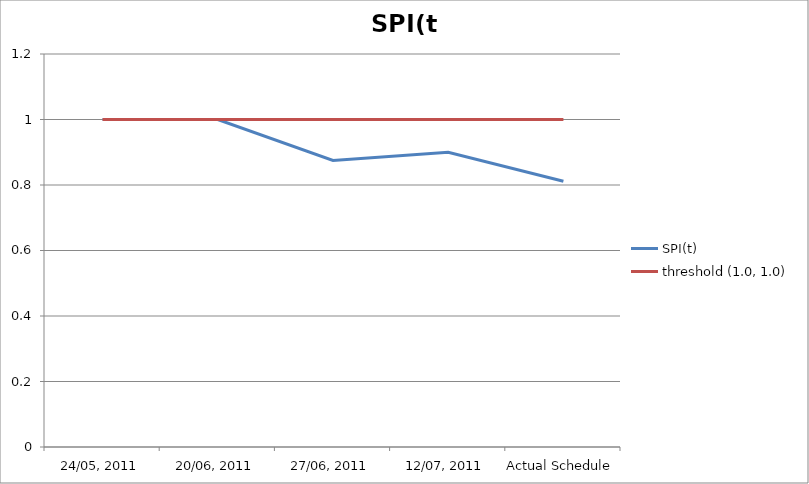
| Category | SPI(t) | threshold (1.0, 1.0) |
|---|---|---|
| 24/05, 2011 | 1 | 1 |
| 20/06, 2011 | 1 | 1 |
| 27/06, 2011 | 0.875 | 1 |
| 12/07, 2011 | 0.9 | 1 |
| Actual Schedule | 0.811 | 1 |